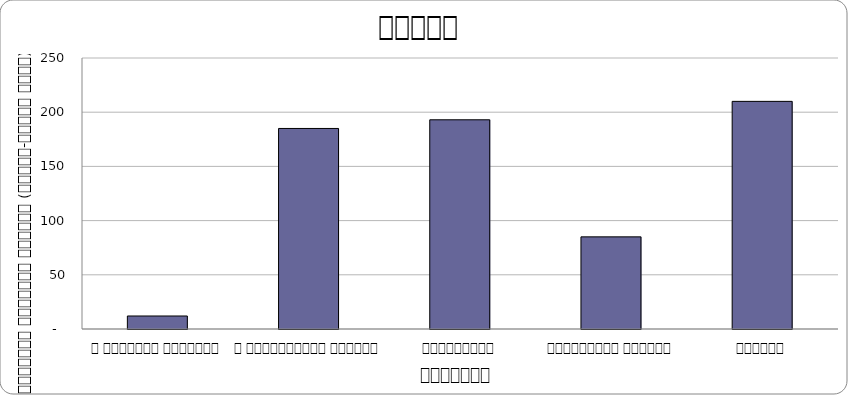
| Category | Series 0 |
|---|---|
| द हिमालयन टाइम्स् | 12 |
| द काठमाण्डौं पोस्ट् | 185 |
| कान्तिपुर | 193 |
| अन्नपूर्ण पोस्ट् | 85 |
| नागरिक | 210 |